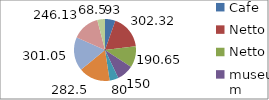
| Category | Series 0 |
|---|---|
| Cafe | 93 |
| Netto | 302.32 |
| Netto | 190.65 |
| museum | 150 |
| museum | 80 |
| Aldi | 282.5 |
| Lidl | 301.05 |
| Netto | 246.13 |
| parkering | 68.5 |